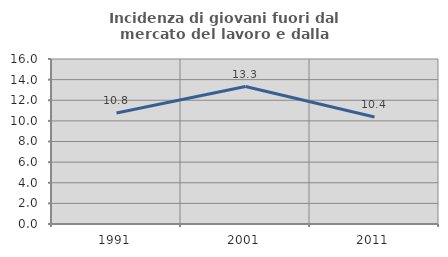
| Category | Incidenza di giovani fuori dal mercato del lavoro e dalla formazione  |
|---|---|
| 1991.0 | 10.759 |
| 2001.0 | 13.333 |
| 2011.0 | 10.383 |